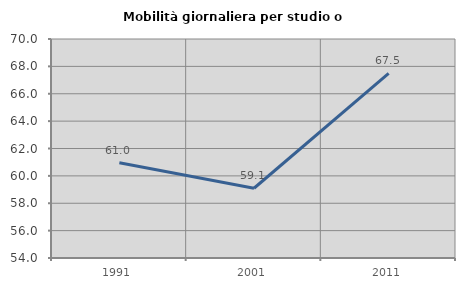
| Category | Mobilità giornaliera per studio o lavoro |
|---|---|
| 1991.0 | 60.964 |
| 2001.0 | 59.097 |
| 2011.0 | 67.494 |